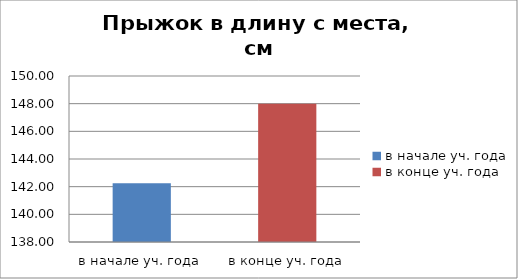
| Category | Series 0 |
|---|---|
| в начале уч. года | 142.25 |
| в конце уч. года | 148 |